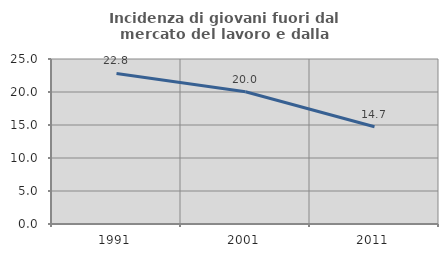
| Category | Incidenza di giovani fuori dal mercato del lavoro e dalla formazione  |
|---|---|
| 1991.0 | 22.81 |
| 2001.0 | 20.04 |
| 2011.0 | 14.724 |